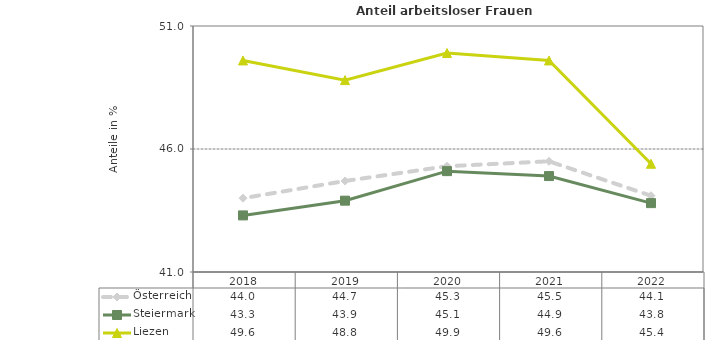
| Category | Österreich | Steiermark | Liezen |
|---|---|---|---|
| 2022.0 | 44.1 | 43.8 | 45.4 |
| 2021.0 | 45.5 | 44.9 | 49.6 |
| 2020.0 | 45.3 | 45.1 | 49.9 |
| 2019.0 | 44.7 | 43.9 | 48.8 |
| 2018.0 | 44 | 43.3 | 49.6 |